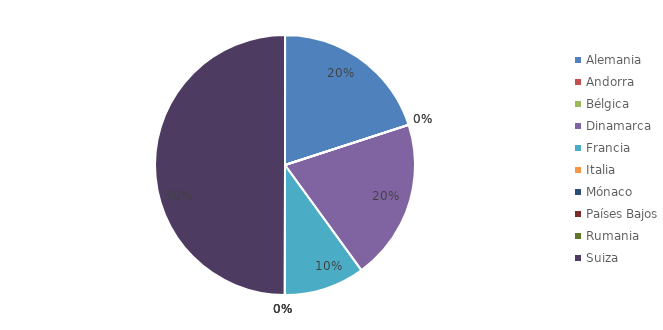
| Category | Series 0 |
|---|---|
| Alemania | 2 |
| Andorra | 0 |
| Bélgica | 0 |
| Dinamarca | 2 |
| Francia | 1 |
| Italia | 0 |
| Mónaco | 0 |
| Países Bajos | 0 |
| Rumania | 0 |
| Suiza | 5 |